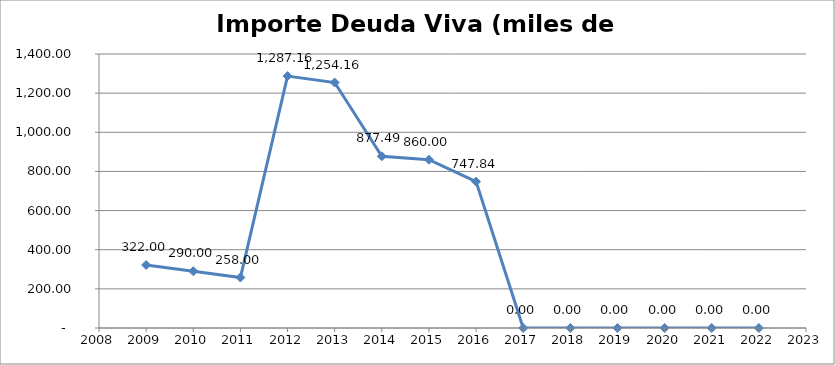
| Category | Importe deuda viva (miles de €) |
|---|---|
| 2009.0 | 322 |
| 2010.0 | 290 |
| 2011.0 | 258 |
| 2012.0 | 1287.161 |
| 2013.0 | 1254.162 |
| 2014.0 | 877.493 |
| 2015.0 | 860 |
| 2016.0 | 747.843 |
| 2017.0 | 0 |
| 2018.0 | 0 |
| 2019.0 | 0 |
| 2020.0 | 0 |
| 2021.0 | 0 |
| 2022.0 | 0 |